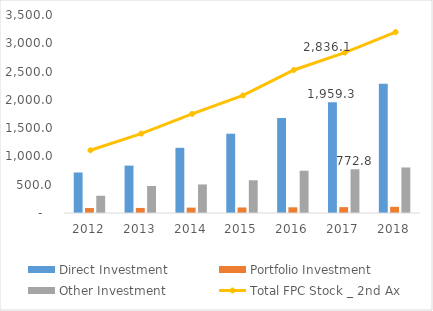
| Category | Direct Investment | Portfolio Investment | Other Investment |
|---|---|---|---|
| 2012.0 | 715.932 | 87.759 | 304.958 |
| 2013.0 | 837.654 | 89.375 | 477.113 |
| 2014.0 | 1152.396 | 94.96 | 504.691 |
| 2015.0 | 1401.803 | 97.502 | 578.637 |
| 2016.0 | 1680.288 | 100.464 | 747.144 |
| 2017.0 | 1959.302 | 103.908 | 772.847 |
| 2018.0 | 2283.709 | 109.286 | 804.899 |